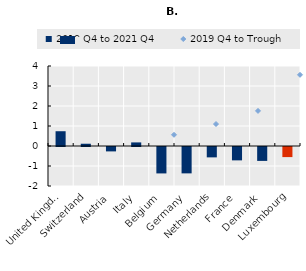
| Category | 2019 Q4 to 2021 Q4 |
|---|---|
| United Kingdom | 0.739 |
| Switzerland | 0.113 |
| Austria | -0.22 |
| Italy | 0.179 |
| Belgium | -1.321 |
| Germany | -1.319 |
| Netherlands | -0.518 |
| France | -0.668 |
| Denmark | -0.695 |
| Luxembourg | -0.505 |